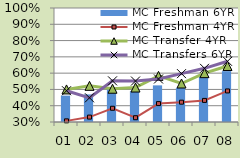
| Category | MC Freshman 6YR |
|---|---|
| 01 | 0.462 |
| 02 | 0.469 |
| 03 | 0.505 |
| 04 | 0.489 |
| 05 | 0.525 |
| 06 | 0.509 |
| 07 | 0.58 |
| 08 | 0.612 |